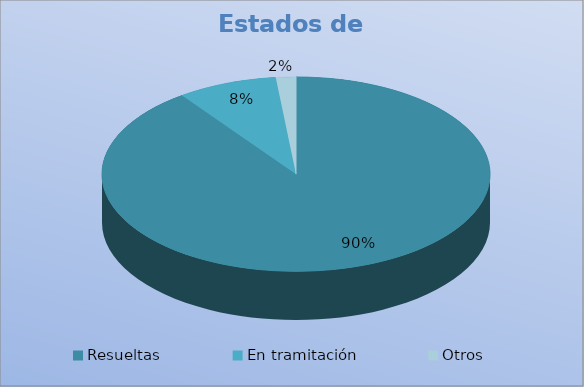
| Category | Series 0 |
|---|---|
| Resueltas | 54 |
| En tramitación | 5 |
| Otros | 1 |